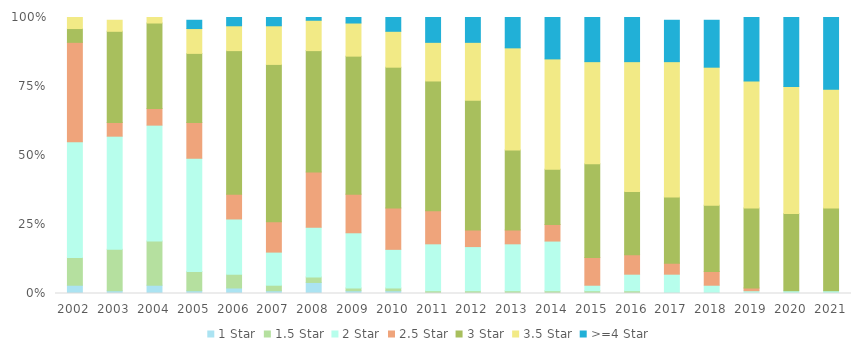
| Category | 1 Star | 1.5 Star | 2 Star | 2.5 Star | 3 Star | 3.5 Star | >=4 Star |
|---|---|---|---|---|---|---|---|
| 2002.0 | 0.03 | 0.1 | 0.42 | 0.36 | 0.05 | 0.05 | 0 |
| 2003.0 | 0.01 | 0.15 | 0.41 | 0.05 | 0.33 | 0.04 | 0 |
| 2004.0 | 0.03 | 0.16 | 0.42 | 0.06 | 0.31 | 0.02 | 0 |
| 2005.0 | 0.01 | 0.07 | 0.41 | 0.13 | 0.25 | 0.09 | 0.03 |
| 2006.0 | 0.02 | 0.05 | 0.2 | 0.09 | 0.52 | 0.09 | 0.03 |
| 2007.0 | 0.01 | 0.02 | 0.12 | 0.11 | 0.57 | 0.14 | 0.03 |
| 2008.0 | 0.04 | 0.02 | 0.18 | 0.2 | 0.44 | 0.11 | 0.01 |
| 2009.0 | 0.01 | 0.01 | 0.2 | 0.14 | 0.5 | 0.12 | 0.02 |
| 2010.0 | 0.01 | 0.01 | 0.14 | 0.15 | 0.51 | 0.13 | 0.05 |
| 2011.0 | 0 | 0.01 | 0.17 | 0.12 | 0.47 | 0.14 | 0.09 |
| 2012.0 | 0 | 0.01 | 0.16 | 0.06 | 0.47 | 0.21 | 0.09 |
| 2013.0 | 0 | 0.01 | 0.17 | 0.05 | 0.29 | 0.37 | 0.11 |
| 2014.0 | 0 | 0.01 | 0.18 | 0.06 | 0.2 | 0.4 | 0.15 |
| 2015.0 | 0 | 0.01 | 0.02 | 0.1 | 0.34 | 0.37 | 0.16 |
| 2016.0 | 0 | 0.01 | 0.06 | 0.07 | 0.23 | 0.47 | 0.17 |
| 2017.0 | 0 | 0 | 0.07 | 0.04 | 0.24 | 0.49 | 0.15 |
| 2018.0 | 0 | 0 | 0.03 | 0.05 | 0.24 | 0.5 | 0.17 |
| 2019.0 | 0 | 0 | 0.01 | 0.01 | 0.29 | 0.46 | 0.23 |
| 2020.0 | 0 | 0 | 0.01 | 0 | 0.28 | 0.46 | 0.25 |
| 2021.0 | 0 | 0 | 0.01 | 0 | 0.3 | 0.43 | 0.26 |